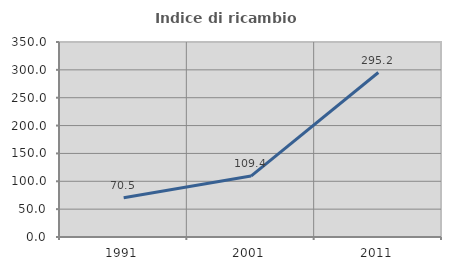
| Category | Indice di ricambio occupazionale  |
|---|---|
| 1991.0 | 70.501 |
| 2001.0 | 109.379 |
| 2011.0 | 295.216 |